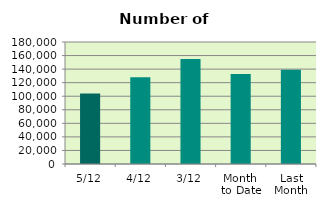
| Category | Series 0 |
|---|---|
| 5/12 | 104008 |
| 4/12 | 127992 |
| 3/12 | 154966 |
| Month 
to Date | 132915.5 |
| Last
Month | 138953.619 |